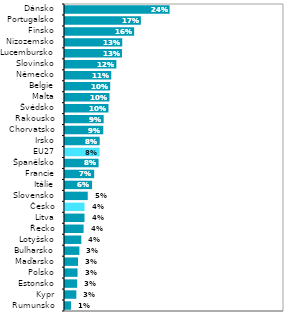
| Category | Series 1 |
|---|---|
| Rumunsko | 0.014 |
| Kypr | 0.026 |
| Estonsko | 0.028 |
| Polsko | 0.029 |
| Maďarsko | 0.03 |
| Bulharsko | 0.033 |
| Lotyšsko | 0.037 |
| Řecko | 0.042 |
| Litva | 0.045 |
| Česko | 0.045 |
| Slovensko | 0.052 |
| Itálie | 0.062 |
| Francie | 0.067 |
| Španělsko | 0.077 |
| EU27 | 0.079 |
| Irsko | 0.079 |
| Chorvatsko | 0.087 |
| Rakousko | 0.088 |
| Švédsko | 0.099 |
| Malta | 0.102 |
| Belgie | 0.103 |
| Německo | 0.106 |
| Slovinsko | 0.117 |
| Lucembursko | 0.13 |
| Nizozemsko | 0.131 |
| Finsko | 0.158 |
| Portugalsko | 0.173 |
| Dánsko | 0.239 |